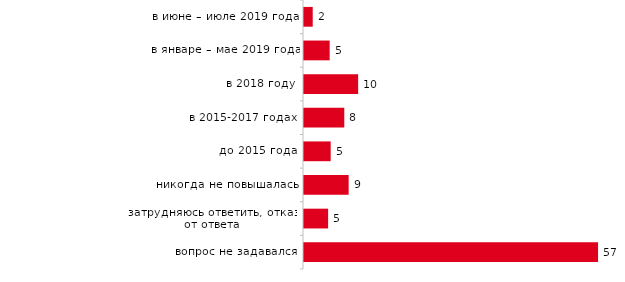
| Category | Series 0 |
|---|---|
| в июне – июле 2019 года | 1.683 |
| в январе – мае 2019 года | 4.95 |
| в 2018 году | 10.446 |
| в 2015-2017 годах | 7.772 |
| до 2015 года | 5.149 |
| никогда не повышалась | 8.614 |
| затрудняюсь ответить, отказ от ответа | 4.653 |
| вопрос не задавался | 56.733 |